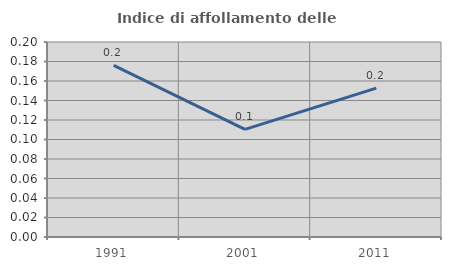
| Category | Indice di affollamento delle abitazioni  |
|---|---|
| 1991.0 | 0.176 |
| 2001.0 | 0.11 |
| 2011.0 | 0.153 |